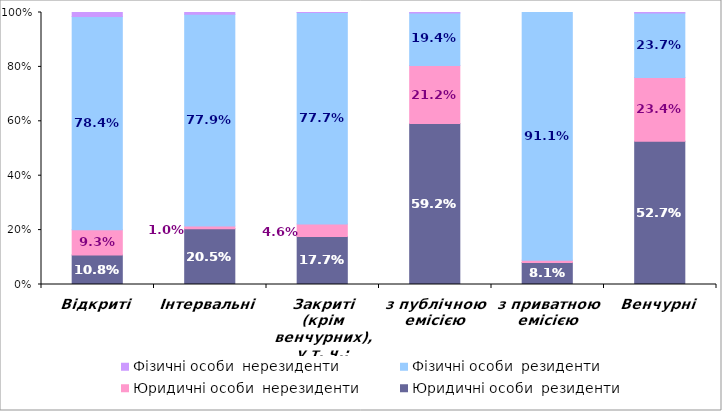
| Category | Юридичні особи  | Фізичні особи  |
|---|---|---|
| Відкриті | 0.093 | 0.015 |
| Інтервальні | 0.01 | 0.006 |
| Закриті (крім венчурних), у т. ч.: | 0.046 | 0 |
| з публічною емісією | 0.212 | 0.002 |
| з приватною емісією | 0.008 | 0 |
| Венчурні | 0.234 | 0.002 |